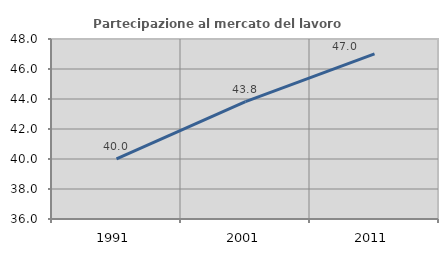
| Category | Partecipazione al mercato del lavoro  femminile |
|---|---|
| 1991.0 | 40.008 |
| 2001.0 | 43.829 |
| 2011.0 | 47.005 |